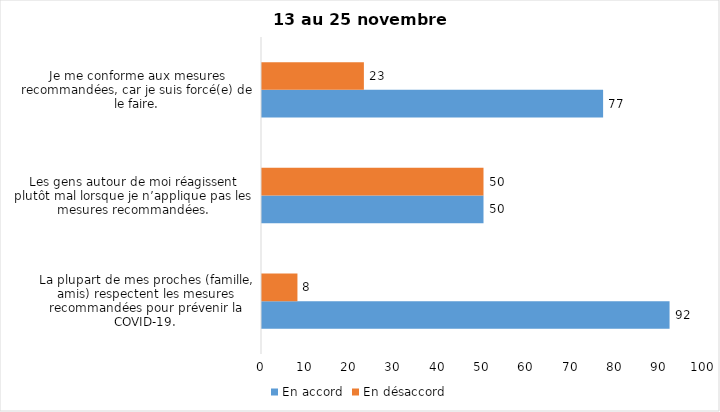
| Category | En accord | En désaccord |
|---|---|---|
| La plupart de mes proches (famille, amis) respectent les mesures recommandées pour prévenir la COVID-19. | 92 | 8 |
| Les gens autour de moi réagissent plutôt mal lorsque je n’applique pas les mesures recommandées. | 50 | 50 |
| Je me conforme aux mesures recommandées, car je suis forcé(e) de le faire. | 77 | 23 |